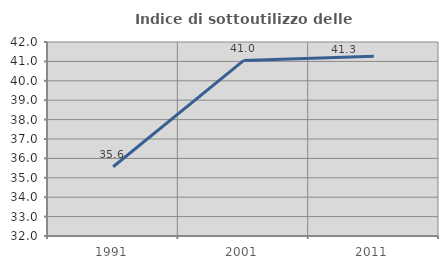
| Category | Indice di sottoutilizzo delle abitazioni  |
|---|---|
| 1991.0 | 35.57 |
| 2001.0 | 41.04 |
| 2011.0 | 41.27 |